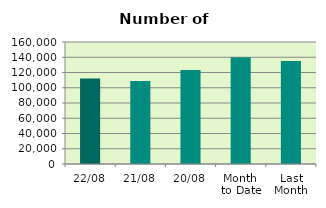
| Category | Series 0 |
|---|---|
| 22/08 | 112024 |
| 21/08 | 108810 |
| 20/08 | 123362 |
| Month 
to Date | 139922.875 |
| Last
Month | 134976 |